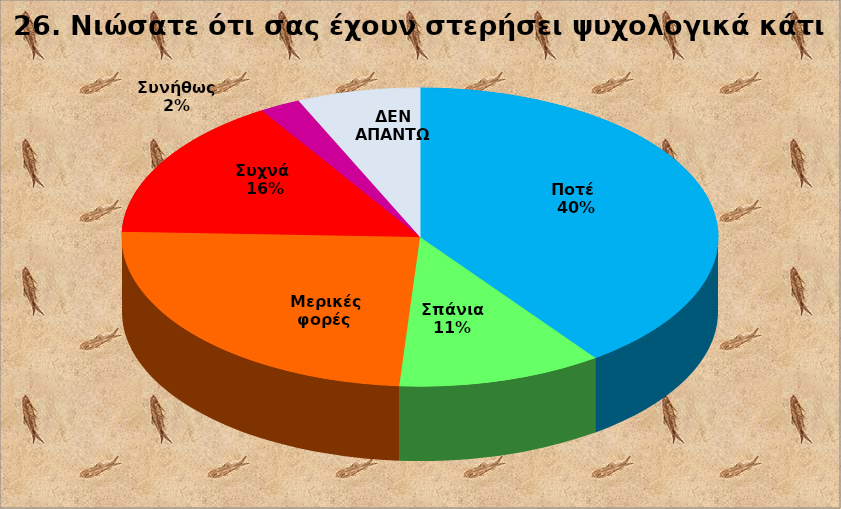
| Category | Series 0 |
|---|---|
| Ποτέ  | 18 |
| Σπάνια  | 5 |
| Μερικές φορές  | 11 |
| Συχνά  | 7 |
| Συνήθως  | 1 |
| ΔΕΝ ΑΠΑΝΤΩ | 3 |